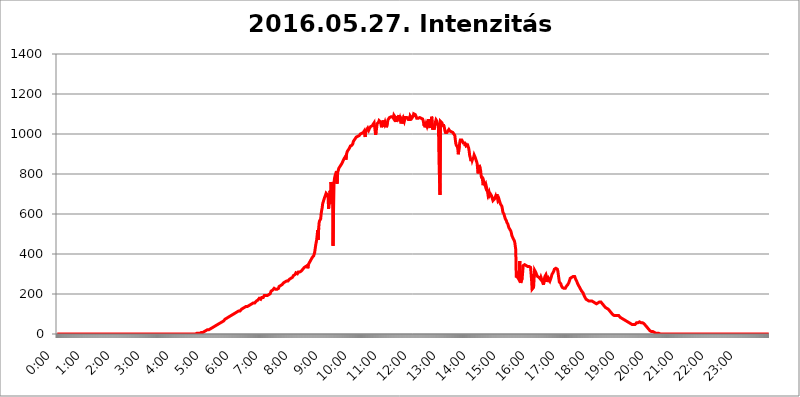
| Category | 2016.05.27. Intenzitás [W/m^2] |
|---|---|
| 0.0 | 0 |
| 0.0006944444444444445 | 0 |
| 0.001388888888888889 | 0 |
| 0.0020833333333333333 | 0 |
| 0.002777777777777778 | 0 |
| 0.003472222222222222 | 0 |
| 0.004166666666666667 | 0 |
| 0.004861111111111111 | 0 |
| 0.005555555555555556 | 0 |
| 0.0062499999999999995 | 0 |
| 0.006944444444444444 | 0 |
| 0.007638888888888889 | 0 |
| 0.008333333333333333 | 0 |
| 0.009027777777777779 | 0 |
| 0.009722222222222222 | 0 |
| 0.010416666666666666 | 0 |
| 0.011111111111111112 | 0 |
| 0.011805555555555555 | 0 |
| 0.012499999999999999 | 0 |
| 0.013194444444444444 | 0 |
| 0.013888888888888888 | 0 |
| 0.014583333333333332 | 0 |
| 0.015277777777777777 | 0 |
| 0.015972222222222224 | 0 |
| 0.016666666666666666 | 0 |
| 0.017361111111111112 | 0 |
| 0.018055555555555557 | 0 |
| 0.01875 | 0 |
| 0.019444444444444445 | 0 |
| 0.02013888888888889 | 0 |
| 0.020833333333333332 | 0 |
| 0.02152777777777778 | 0 |
| 0.022222222222222223 | 0 |
| 0.02291666666666667 | 0 |
| 0.02361111111111111 | 0 |
| 0.024305555555555556 | 0 |
| 0.024999999999999998 | 0 |
| 0.025694444444444447 | 0 |
| 0.02638888888888889 | 0 |
| 0.027083333333333334 | 0 |
| 0.027777777777777776 | 0 |
| 0.02847222222222222 | 0 |
| 0.029166666666666664 | 0 |
| 0.029861111111111113 | 0 |
| 0.030555555555555555 | 0 |
| 0.03125 | 0 |
| 0.03194444444444445 | 0 |
| 0.03263888888888889 | 0 |
| 0.03333333333333333 | 0 |
| 0.034027777777777775 | 0 |
| 0.034722222222222224 | 0 |
| 0.035416666666666666 | 0 |
| 0.036111111111111115 | 0 |
| 0.03680555555555556 | 0 |
| 0.0375 | 0 |
| 0.03819444444444444 | 0 |
| 0.03888888888888889 | 0 |
| 0.03958333333333333 | 0 |
| 0.04027777777777778 | 0 |
| 0.04097222222222222 | 0 |
| 0.041666666666666664 | 0 |
| 0.042361111111111106 | 0 |
| 0.04305555555555556 | 0 |
| 0.043750000000000004 | 0 |
| 0.044444444444444446 | 0 |
| 0.04513888888888889 | 0 |
| 0.04583333333333334 | 0 |
| 0.04652777777777778 | 0 |
| 0.04722222222222222 | 0 |
| 0.04791666666666666 | 0 |
| 0.04861111111111111 | 0 |
| 0.049305555555555554 | 0 |
| 0.049999999999999996 | 0 |
| 0.05069444444444445 | 0 |
| 0.051388888888888894 | 0 |
| 0.052083333333333336 | 0 |
| 0.05277777777777778 | 0 |
| 0.05347222222222222 | 0 |
| 0.05416666666666667 | 0 |
| 0.05486111111111111 | 0 |
| 0.05555555555555555 | 0 |
| 0.05625 | 0 |
| 0.05694444444444444 | 0 |
| 0.057638888888888885 | 0 |
| 0.05833333333333333 | 0 |
| 0.05902777777777778 | 0 |
| 0.059722222222222225 | 0 |
| 0.06041666666666667 | 0 |
| 0.061111111111111116 | 0 |
| 0.06180555555555556 | 0 |
| 0.0625 | 0 |
| 0.06319444444444444 | 0 |
| 0.06388888888888888 | 0 |
| 0.06458333333333334 | 0 |
| 0.06527777777777778 | 0 |
| 0.06597222222222222 | 0 |
| 0.06666666666666667 | 0 |
| 0.06736111111111111 | 0 |
| 0.06805555555555555 | 0 |
| 0.06874999999999999 | 0 |
| 0.06944444444444443 | 0 |
| 0.07013888888888889 | 0 |
| 0.07083333333333333 | 0 |
| 0.07152777777777779 | 0 |
| 0.07222222222222223 | 0 |
| 0.07291666666666667 | 0 |
| 0.07361111111111111 | 0 |
| 0.07430555555555556 | 0 |
| 0.075 | 0 |
| 0.07569444444444444 | 0 |
| 0.0763888888888889 | 0 |
| 0.07708333333333334 | 0 |
| 0.07777777777777778 | 0 |
| 0.07847222222222222 | 0 |
| 0.07916666666666666 | 0 |
| 0.0798611111111111 | 0 |
| 0.08055555555555556 | 0 |
| 0.08125 | 0 |
| 0.08194444444444444 | 0 |
| 0.08263888888888889 | 0 |
| 0.08333333333333333 | 0 |
| 0.08402777777777777 | 0 |
| 0.08472222222222221 | 0 |
| 0.08541666666666665 | 0 |
| 0.08611111111111112 | 0 |
| 0.08680555555555557 | 0 |
| 0.08750000000000001 | 0 |
| 0.08819444444444445 | 0 |
| 0.08888888888888889 | 0 |
| 0.08958333333333333 | 0 |
| 0.09027777777777778 | 0 |
| 0.09097222222222222 | 0 |
| 0.09166666666666667 | 0 |
| 0.09236111111111112 | 0 |
| 0.09305555555555556 | 0 |
| 0.09375 | 0 |
| 0.09444444444444444 | 0 |
| 0.09513888888888888 | 0 |
| 0.09583333333333333 | 0 |
| 0.09652777777777777 | 0 |
| 0.09722222222222222 | 0 |
| 0.09791666666666667 | 0 |
| 0.09861111111111111 | 0 |
| 0.09930555555555555 | 0 |
| 0.09999999999999999 | 0 |
| 0.10069444444444443 | 0 |
| 0.1013888888888889 | 0 |
| 0.10208333333333335 | 0 |
| 0.10277777777777779 | 0 |
| 0.10347222222222223 | 0 |
| 0.10416666666666667 | 0 |
| 0.10486111111111111 | 0 |
| 0.10555555555555556 | 0 |
| 0.10625 | 0 |
| 0.10694444444444444 | 0 |
| 0.1076388888888889 | 0 |
| 0.10833333333333334 | 0 |
| 0.10902777777777778 | 0 |
| 0.10972222222222222 | 0 |
| 0.1111111111111111 | 0 |
| 0.11180555555555556 | 0 |
| 0.11180555555555556 | 0 |
| 0.1125 | 0 |
| 0.11319444444444444 | 0 |
| 0.11388888888888889 | 0 |
| 0.11458333333333333 | 0 |
| 0.11527777777777777 | 0 |
| 0.11597222222222221 | 0 |
| 0.11666666666666665 | 0 |
| 0.1173611111111111 | 0 |
| 0.11805555555555557 | 0 |
| 0.11944444444444445 | 0 |
| 0.12013888888888889 | 0 |
| 0.12083333333333333 | 0 |
| 0.12152777777777778 | 0 |
| 0.12222222222222223 | 0 |
| 0.12291666666666667 | 0 |
| 0.12291666666666667 | 0 |
| 0.12361111111111112 | 0 |
| 0.12430555555555556 | 0 |
| 0.125 | 0 |
| 0.12569444444444444 | 0 |
| 0.12638888888888888 | 0 |
| 0.12708333333333333 | 0 |
| 0.16875 | 0 |
| 0.12847222222222224 | 0 |
| 0.12916666666666668 | 0 |
| 0.12986111111111112 | 0 |
| 0.13055555555555556 | 0 |
| 0.13125 | 0 |
| 0.13194444444444445 | 0 |
| 0.1326388888888889 | 0 |
| 0.13333333333333333 | 0 |
| 0.13402777777777777 | 0 |
| 0.13402777777777777 | 0 |
| 0.13472222222222222 | 0 |
| 0.13541666666666666 | 0 |
| 0.1361111111111111 | 0 |
| 0.13749999999999998 | 0 |
| 0.13819444444444443 | 0 |
| 0.1388888888888889 | 0 |
| 0.13958333333333334 | 0 |
| 0.14027777777777778 | 0 |
| 0.14097222222222222 | 0 |
| 0.14166666666666666 | 0 |
| 0.1423611111111111 | 0 |
| 0.14305555555555557 | 0 |
| 0.14375000000000002 | 0 |
| 0.14444444444444446 | 0 |
| 0.1451388888888889 | 0 |
| 0.1451388888888889 | 0 |
| 0.14652777777777778 | 0 |
| 0.14722222222222223 | 0 |
| 0.14791666666666667 | 0 |
| 0.1486111111111111 | 0 |
| 0.14930555555555555 | 0 |
| 0.15 | 0 |
| 0.15069444444444444 | 0 |
| 0.15138888888888888 | 0 |
| 0.15208333333333332 | 0 |
| 0.15277777777777776 | 0 |
| 0.15347222222222223 | 0 |
| 0.15416666666666667 | 0 |
| 0.15486111111111112 | 0 |
| 0.15555555555555556 | 0 |
| 0.15625 | 0 |
| 0.15694444444444444 | 0 |
| 0.15763888888888888 | 0 |
| 0.15833333333333333 | 0 |
| 0.15902777777777777 | 0 |
| 0.15972222222222224 | 0 |
| 0.16041666666666668 | 0 |
| 0.16111111111111112 | 0 |
| 0.16180555555555556 | 0 |
| 0.1625 | 0 |
| 0.16319444444444445 | 0 |
| 0.1638888888888889 | 0 |
| 0.16458333333333333 | 0 |
| 0.16527777777777777 | 0 |
| 0.16597222222222222 | 0 |
| 0.16666666666666666 | 0 |
| 0.1673611111111111 | 0 |
| 0.16805555555555554 | 0 |
| 0.16874999999999998 | 0 |
| 0.16944444444444443 | 0 |
| 0.17013888888888887 | 0 |
| 0.1708333333333333 | 0 |
| 0.17152777777777775 | 0 |
| 0.17222222222222225 | 0 |
| 0.1729166666666667 | 0 |
| 0.17361111111111113 | 0 |
| 0.17430555555555557 | 0 |
| 0.17500000000000002 | 0 |
| 0.17569444444444446 | 0 |
| 0.1763888888888889 | 0 |
| 0.17708333333333334 | 0 |
| 0.17777777777777778 | 0 |
| 0.17847222222222223 | 0 |
| 0.17916666666666667 | 0 |
| 0.1798611111111111 | 0 |
| 0.18055555555555555 | 0 |
| 0.18125 | 0 |
| 0.18194444444444444 | 0 |
| 0.1826388888888889 | 0 |
| 0.18333333333333335 | 0 |
| 0.1840277777777778 | 0 |
| 0.18472222222222223 | 0 |
| 0.18541666666666667 | 0 |
| 0.18611111111111112 | 0 |
| 0.18680555555555556 | 0 |
| 0.1875 | 0 |
| 0.18819444444444444 | 0 |
| 0.18888888888888888 | 0 |
| 0.18958333333333333 | 0 |
| 0.19027777777777777 | 0 |
| 0.1909722222222222 | 0 |
| 0.19166666666666665 | 0 |
| 0.19236111111111112 | 0 |
| 0.19305555555555554 | 0 |
| 0.19375 | 0 |
| 0.19444444444444445 | 3.525 |
| 0.1951388888888889 | 3.525 |
| 0.19583333333333333 | 3.525 |
| 0.19652777777777777 | 3.525 |
| 0.19722222222222222 | 3.525 |
| 0.19791666666666666 | 3.525 |
| 0.1986111111111111 | 3.525 |
| 0.19930555555555554 | 3.525 |
| 0.19999999999999998 | 3.525 |
| 0.20069444444444443 | 3.525 |
| 0.20138888888888887 | 7.887 |
| 0.2020833333333333 | 7.887 |
| 0.2027777777777778 | 7.887 |
| 0.2034722222222222 | 7.887 |
| 0.2041666666666667 | 7.887 |
| 0.20486111111111113 | 12.257 |
| 0.20555555555555557 | 12.257 |
| 0.20625000000000002 | 12.257 |
| 0.20694444444444446 | 12.257 |
| 0.2076388888888889 | 12.257 |
| 0.20833333333333334 | 16.636 |
| 0.20902777777777778 | 16.636 |
| 0.20972222222222223 | 16.636 |
| 0.21041666666666667 | 21.024 |
| 0.2111111111111111 | 21.024 |
| 0.21180555555555555 | 21.024 |
| 0.2125 | 21.024 |
| 0.21319444444444444 | 25.419 |
| 0.2138888888888889 | 25.419 |
| 0.21458333333333335 | 25.419 |
| 0.2152777777777778 | 29.823 |
| 0.21597222222222223 | 29.823 |
| 0.21666666666666667 | 29.823 |
| 0.21736111111111112 | 29.823 |
| 0.21805555555555556 | 34.234 |
| 0.21875 | 34.234 |
| 0.21944444444444444 | 34.234 |
| 0.22013888888888888 | 38.653 |
| 0.22083333333333333 | 38.653 |
| 0.22152777777777777 | 38.653 |
| 0.2222222222222222 | 43.079 |
| 0.22291666666666665 | 43.079 |
| 0.2236111111111111 | 47.511 |
| 0.22430555555555556 | 47.511 |
| 0.225 | 47.511 |
| 0.22569444444444445 | 47.511 |
| 0.2263888888888889 | 51.951 |
| 0.22708333333333333 | 51.951 |
| 0.22777777777777777 | 56.398 |
| 0.22847222222222222 | 56.398 |
| 0.22916666666666666 | 56.398 |
| 0.2298611111111111 | 60.85 |
| 0.23055555555555554 | 60.85 |
| 0.23124999999999998 | 60.85 |
| 0.23194444444444443 | 65.31 |
| 0.23263888888888887 | 65.31 |
| 0.2333333333333333 | 65.31 |
| 0.2340277777777778 | 69.775 |
| 0.2347222222222222 | 69.775 |
| 0.2354166666666667 | 74.246 |
| 0.23611111111111113 | 74.246 |
| 0.23680555555555557 | 74.246 |
| 0.23750000000000002 | 78.722 |
| 0.23819444444444446 | 78.722 |
| 0.2388888888888889 | 83.205 |
| 0.23958333333333334 | 83.205 |
| 0.24027777777777778 | 83.205 |
| 0.24097222222222223 | 83.205 |
| 0.24166666666666667 | 87.692 |
| 0.2423611111111111 | 92.184 |
| 0.24305555555555555 | 92.184 |
| 0.24375 | 92.184 |
| 0.24444444444444446 | 92.184 |
| 0.24513888888888888 | 96.682 |
| 0.24583333333333335 | 96.682 |
| 0.2465277777777778 | 96.682 |
| 0.24722222222222223 | 101.184 |
| 0.24791666666666667 | 101.184 |
| 0.24861111111111112 | 101.184 |
| 0.24930555555555556 | 105.69 |
| 0.25 | 105.69 |
| 0.25069444444444444 | 105.69 |
| 0.2513888888888889 | 110.201 |
| 0.2520833333333333 | 110.201 |
| 0.25277777777777777 | 110.201 |
| 0.2534722222222222 | 110.201 |
| 0.25416666666666665 | 114.716 |
| 0.2548611111111111 | 114.716 |
| 0.2555555555555556 | 114.716 |
| 0.25625000000000003 | 114.716 |
| 0.2569444444444445 | 114.716 |
| 0.2576388888888889 | 119.235 |
| 0.25833333333333336 | 123.758 |
| 0.2590277777777778 | 123.758 |
| 0.25972222222222224 | 123.758 |
| 0.2604166666666667 | 128.284 |
| 0.2611111111111111 | 128.284 |
| 0.26180555555555557 | 128.284 |
| 0.2625 | 132.814 |
| 0.26319444444444445 | 132.814 |
| 0.2638888888888889 | 132.814 |
| 0.26458333333333334 | 137.347 |
| 0.2652777777777778 | 137.347 |
| 0.2659722222222222 | 137.347 |
| 0.26666666666666666 | 137.347 |
| 0.2673611111111111 | 137.347 |
| 0.26805555555555555 | 141.884 |
| 0.26875 | 141.884 |
| 0.26944444444444443 | 146.423 |
| 0.2701388888888889 | 146.423 |
| 0.2708333333333333 | 146.423 |
| 0.27152777777777776 | 146.423 |
| 0.2722222222222222 | 150.964 |
| 0.27291666666666664 | 150.964 |
| 0.2736111111111111 | 150.964 |
| 0.2743055555555555 | 155.509 |
| 0.27499999999999997 | 155.509 |
| 0.27569444444444446 | 150.964 |
| 0.27638888888888885 | 150.964 |
| 0.27708333333333335 | 155.509 |
| 0.2777777777777778 | 150.964 |
| 0.27847222222222223 | 160.056 |
| 0.2791666666666667 | 164.605 |
| 0.2798611111111111 | 164.605 |
| 0.28055555555555556 | 160.056 |
| 0.28125 | 169.156 |
| 0.28194444444444444 | 173.709 |
| 0.2826388888888889 | 173.709 |
| 0.2833333333333333 | 178.264 |
| 0.28402777777777777 | 178.264 |
| 0.2847222222222222 | 178.264 |
| 0.28541666666666665 | 173.709 |
| 0.28611111111111115 | 178.264 |
| 0.28680555555555554 | 182.82 |
| 0.28750000000000003 | 182.82 |
| 0.2881944444444445 | 182.82 |
| 0.2888888888888889 | 182.82 |
| 0.28958333333333336 | 187.378 |
| 0.2902777777777778 | 191.937 |
| 0.29097222222222224 | 191.937 |
| 0.2916666666666667 | 191.937 |
| 0.2923611111111111 | 191.937 |
| 0.29305555555555557 | 187.378 |
| 0.29375 | 191.937 |
| 0.29444444444444445 | 191.937 |
| 0.2951388888888889 | 191.937 |
| 0.29583333333333334 | 191.937 |
| 0.2965277777777778 | 196.497 |
| 0.2972222222222222 | 201.058 |
| 0.29791666666666666 | 201.058 |
| 0.2986111111111111 | 201.058 |
| 0.29930555555555555 | 205.62 |
| 0.3 | 214.746 |
| 0.30069444444444443 | 214.746 |
| 0.3013888888888889 | 214.746 |
| 0.3020833333333333 | 219.309 |
| 0.30277777777777776 | 219.309 |
| 0.3034722222222222 | 223.873 |
| 0.30416666666666664 | 228.436 |
| 0.3048611111111111 | 223.873 |
| 0.3055555555555555 | 223.873 |
| 0.30624999999999997 | 223.873 |
| 0.3069444444444444 | 228.436 |
| 0.3076388888888889 | 228.436 |
| 0.30833333333333335 | 223.873 |
| 0.3090277777777778 | 223.873 |
| 0.30972222222222223 | 223.873 |
| 0.3104166666666667 | 228.436 |
| 0.3111111111111111 | 237.564 |
| 0.31180555555555556 | 237.564 |
| 0.3125 | 242.127 |
| 0.31319444444444444 | 242.127 |
| 0.3138888888888889 | 242.127 |
| 0.3145833333333333 | 242.127 |
| 0.31527777777777777 | 246.689 |
| 0.3159722222222222 | 246.689 |
| 0.31666666666666665 | 251.251 |
| 0.31736111111111115 | 255.813 |
| 0.31805555555555554 | 255.813 |
| 0.31875000000000003 | 255.813 |
| 0.3194444444444445 | 260.373 |
| 0.3201388888888889 | 260.373 |
| 0.32083333333333336 | 260.373 |
| 0.3215277777777778 | 264.932 |
| 0.32222222222222224 | 269.49 |
| 0.3229166666666667 | 260.373 |
| 0.3236111111111111 | 264.932 |
| 0.32430555555555557 | 269.49 |
| 0.325 | 269.49 |
| 0.32569444444444445 | 274.047 |
| 0.3263888888888889 | 278.603 |
| 0.32708333333333334 | 278.603 |
| 0.3277777777777778 | 278.603 |
| 0.3284722222222222 | 274.047 |
| 0.32916666666666666 | 278.603 |
| 0.3298611111111111 | 283.156 |
| 0.33055555555555555 | 287.709 |
| 0.33125 | 292.259 |
| 0.33194444444444443 | 292.259 |
| 0.3326388888888889 | 296.808 |
| 0.3333333333333333 | 296.808 |
| 0.3340277777777778 | 301.354 |
| 0.3347222222222222 | 305.898 |
| 0.3354166666666667 | 305.898 |
| 0.3361111111111111 | 305.898 |
| 0.3368055555555556 | 301.354 |
| 0.33749999999999997 | 305.898 |
| 0.33819444444444446 | 310.44 |
| 0.33888888888888885 | 310.44 |
| 0.33958333333333335 | 310.44 |
| 0.34027777777777773 | 310.44 |
| 0.34097222222222223 | 310.44 |
| 0.3416666666666666 | 310.44 |
| 0.3423611111111111 | 314.98 |
| 0.3430555555555555 | 319.517 |
| 0.34375 | 319.517 |
| 0.3444444444444445 | 324.052 |
| 0.3451388888888889 | 324.052 |
| 0.3458333333333334 | 328.584 |
| 0.34652777777777777 | 333.113 |
| 0.34722222222222227 | 333.113 |
| 0.34791666666666665 | 337.639 |
| 0.34861111111111115 | 337.639 |
| 0.34930555555555554 | 342.162 |
| 0.35000000000000003 | 342.162 |
| 0.3506944444444444 | 342.162 |
| 0.3513888888888889 | 328.584 |
| 0.3520833333333333 | 346.682 |
| 0.3527777777777778 | 351.198 |
| 0.3534722222222222 | 355.712 |
| 0.3541666666666667 | 360.221 |
| 0.3548611111111111 | 364.728 |
| 0.35555555555555557 | 369.23 |
| 0.35625 | 373.729 |
| 0.35694444444444445 | 378.224 |
| 0.3576388888888889 | 382.715 |
| 0.35833333333333334 | 387.202 |
| 0.3590277777777778 | 387.202 |
| 0.3597222222222222 | 391.685 |
| 0.36041666666666666 | 400.638 |
| 0.3611111111111111 | 409.574 |
| 0.36180555555555555 | 427.39 |
| 0.3625 | 445.129 |
| 0.36319444444444443 | 458.38 |
| 0.3638888888888889 | 471.582 |
| 0.3645833333333333 | 475.972 |
| 0.3652777777777778 | 519.555 |
| 0.3659722222222222 | 471.582 |
| 0.3666666666666667 | 528.2 |
| 0.3673611111111111 | 558.261 |
| 0.3680555555555556 | 566.793 |
| 0.36874999999999997 | 562.53 |
| 0.36944444444444446 | 575.299 |
| 0.37013888888888885 | 600.661 |
| 0.37083333333333335 | 617.436 |
| 0.37152777777777773 | 629.948 |
| 0.37222222222222223 | 650.667 |
| 0.3729166666666666 | 658.909 |
| 0.3736111111111111 | 667.123 |
| 0.3743055555555555 | 667.123 |
| 0.375 | 683.473 |
| 0.3756944444444445 | 683.473 |
| 0.3763888888888889 | 695.666 |
| 0.3770833333333334 | 703.762 |
| 0.37777777777777777 | 699.717 |
| 0.37847222222222227 | 699.717 |
| 0.37916666666666665 | 695.666 |
| 0.37986111111111115 | 683.473 |
| 0.38055555555555554 | 625.784 |
| 0.38125000000000003 | 621.613 |
| 0.3819444444444444 | 687.544 |
| 0.3826388888888889 | 715.858 |
| 0.3833333333333333 | 650.667 |
| 0.3840277777777778 | 759.723 |
| 0.3847222222222222 | 747.834 |
| 0.3854166666666667 | 715.858 |
| 0.3861111111111111 | 699.717 |
| 0.38680555555555557 | 440.702 |
| 0.3875 | 617.436 |
| 0.38819444444444445 | 755.766 |
| 0.3888888888888889 | 779.42 |
| 0.38958333333333334 | 791.169 |
| 0.3902777777777778 | 795.074 |
| 0.3909722222222222 | 806.757 |
| 0.39166666666666666 | 814.519 |
| 0.3923611111111111 | 751.803 |
| 0.39305555555555555 | 798.974 |
| 0.39375 | 814.519 |
| 0.39444444444444443 | 822.26 |
| 0.3951388888888889 | 829.981 |
| 0.3958333333333333 | 833.834 |
| 0.3965277777777778 | 837.682 |
| 0.3972222222222222 | 841.526 |
| 0.3979166666666667 | 845.365 |
| 0.3986111111111111 | 849.199 |
| 0.3993055555555556 | 853.029 |
| 0.39999999999999997 | 856.855 |
| 0.40069444444444446 | 864.493 |
| 0.40138888888888885 | 868.305 |
| 0.40208333333333335 | 868.305 |
| 0.40277777777777773 | 879.719 |
| 0.40347222222222223 | 883.516 |
| 0.4041666666666666 | 887.309 |
| 0.4048611111111111 | 872.114 |
| 0.4055555555555555 | 894.885 |
| 0.40625 | 906.223 |
| 0.4069444444444445 | 913.766 |
| 0.4076388888888889 | 917.534 |
| 0.4083333333333334 | 921.298 |
| 0.40902777777777777 | 921.298 |
| 0.40972222222222227 | 928.819 |
| 0.41041666666666665 | 928.819 |
| 0.41111111111111115 | 940.082 |
| 0.41180555555555554 | 940.082 |
| 0.41250000000000003 | 940.082 |
| 0.4131944444444444 | 943.832 |
| 0.4138888888888889 | 947.58 |
| 0.4145833333333333 | 951.327 |
| 0.4152777777777778 | 962.555 |
| 0.4159722222222222 | 966.295 |
| 0.4166666666666667 | 970.034 |
| 0.4173611111111111 | 973.772 |
| 0.41805555555555557 | 977.508 |
| 0.41875 | 981.244 |
| 0.41944444444444445 | 984.98 |
| 0.4201388888888889 | 984.98 |
| 0.42083333333333334 | 984.98 |
| 0.4215277777777778 | 988.714 |
| 0.4222222222222222 | 992.448 |
| 0.42291666666666666 | 988.714 |
| 0.4236111111111111 | 992.448 |
| 0.42430555555555555 | 996.182 |
| 0.425 | 999.916 |
| 0.42569444444444443 | 999.916 |
| 0.4263888888888889 | 1003.65 |
| 0.4270833333333333 | 1003.65 |
| 0.4277777777777778 | 1003.65 |
| 0.4284722222222222 | 1003.65 |
| 0.4291666666666667 | 1007.383 |
| 0.4298611111111111 | 1011.118 |
| 0.4305555555555556 | 1014.852 |
| 0.43124999999999997 | 1018.587 |
| 0.43194444444444446 | 984.98 |
| 0.43263888888888885 | 1022.323 |
| 0.43333333333333335 | 1014.852 |
| 0.43402777777777773 | 1022.323 |
| 0.43472222222222223 | 1026.06 |
| 0.4354166666666666 | 1029.798 |
| 0.4361111111111111 | 1026.06 |
| 0.4368055555555555 | 1018.587 |
| 0.4375 | 1022.323 |
| 0.4381944444444445 | 1029.798 |
| 0.4388888888888889 | 1033.537 |
| 0.4395833333333334 | 1037.277 |
| 0.44027777777777777 | 1037.277 |
| 0.44097222222222227 | 1037.277 |
| 0.44166666666666665 | 1041.019 |
| 0.44236111111111115 | 1044.762 |
| 0.44305555555555554 | 1048.508 |
| 0.44375000000000003 | 1052.255 |
| 0.4444444444444444 | 1056.004 |
| 0.4451388888888889 | 1056.004 |
| 0.4458333333333333 | 1052.255 |
| 0.4465277777777778 | 996.182 |
| 0.4472222222222222 | 1011.118 |
| 0.4479166666666667 | 1029.798 |
| 0.4486111111111111 | 1052.255 |
| 0.44930555555555557 | 1052.255 |
| 0.45 | 1052.255 |
| 0.45069444444444445 | 1059.756 |
| 0.4513888888888889 | 1067.267 |
| 0.45208333333333334 | 1067.267 |
| 0.4527777777777778 | 1063.51 |
| 0.4534722222222222 | 1059.756 |
| 0.45416666666666666 | 1063.51 |
| 0.4548611111111111 | 1033.537 |
| 0.45555555555555555 | 1048.508 |
| 0.45625 | 1037.277 |
| 0.45694444444444443 | 1067.267 |
| 0.4576388888888889 | 1037.277 |
| 0.4583333333333333 | 1063.51 |
| 0.4590277777777778 | 1052.255 |
| 0.4597222222222222 | 1059.756 |
| 0.4604166666666667 | 1056.004 |
| 0.4611111111111111 | 1056.004 |
| 0.4618055555555556 | 1033.537 |
| 0.46249999999999997 | 1033.537 |
| 0.46319444444444446 | 1059.756 |
| 0.46388888888888885 | 1071.027 |
| 0.46458333333333335 | 1074.789 |
| 0.46527777777777773 | 1074.789 |
| 0.46597222222222223 | 1082.324 |
| 0.4666666666666666 | 1078.555 |
| 0.4673611111111111 | 1078.555 |
| 0.4680555555555555 | 1086.097 |
| 0.46875 | 1086.097 |
| 0.4694444444444445 | 1089.873 |
| 0.4701388888888889 | 1086.097 |
| 0.4708333333333334 | 1086.097 |
| 0.47152777777777777 | 1078.555 |
| 0.47222222222222227 | 1093.653 |
| 0.47291666666666665 | 1093.653 |
| 0.47361111111111115 | 1086.097 |
| 0.47430555555555554 | 1089.873 |
| 0.47500000000000003 | 1059.756 |
| 0.4756944444444444 | 1089.873 |
| 0.4763888888888889 | 1063.51 |
| 0.4770833333333333 | 1067.267 |
| 0.4777777777777778 | 1082.324 |
| 0.4784722222222222 | 1082.324 |
| 0.4791666666666667 | 1093.653 |
| 0.4798611111111111 | 1071.027 |
| 0.48055555555555557 | 1078.555 |
| 0.48125 | 1067.267 |
| 0.48194444444444445 | 1071.027 |
| 0.4826388888888889 | 1074.789 |
| 0.48333333333333334 | 1052.255 |
| 0.4840277777777778 | 1063.51 |
| 0.4847222222222222 | 1071.027 |
| 0.48541666666666666 | 1078.555 |
| 0.4861111111111111 | 1082.324 |
| 0.48680555555555555 | 1063.51 |
| 0.4875 | 1067.267 |
| 0.48819444444444443 | 1082.324 |
| 0.4888888888888889 | 1082.324 |
| 0.4895833333333333 | 1078.555 |
| 0.4902777777777778 | 1082.324 |
| 0.4909722222222222 | 1082.324 |
| 0.4916666666666667 | 1078.555 |
| 0.4923611111111111 | 1074.789 |
| 0.4930555555555556 | 1067.267 |
| 0.49374999999999997 | 1086.097 |
| 0.49444444444444446 | 1067.267 |
| 0.49513888888888885 | 1089.873 |
| 0.49583333333333335 | 1093.653 |
| 0.49652777777777773 | 1086.097 |
| 0.49722222222222223 | 1078.555 |
| 0.4979166666666666 | 1074.789 |
| 0.4986111111111111 | 1082.324 |
| 0.4993055555555555 | 1089.873 |
| 0.5 | 1101.226 |
| 0.5006944444444444 | 1101.226 |
| 0.5013888888888889 | 1097.437 |
| 0.5020833333333333 | 1097.437 |
| 0.5027777777777778 | 1093.653 |
| 0.5034722222222222 | 1086.097 |
| 0.5041666666666667 | 1078.555 |
| 0.5048611111111111 | 1082.324 |
| 0.5055555555555555 | 1082.324 |
| 0.50625 | 1078.555 |
| 0.5069444444444444 | 1078.555 |
| 0.5076388888888889 | 1078.555 |
| 0.5083333333333333 | 1082.324 |
| 0.5090277777777777 | 1078.555 |
| 0.5097222222222222 | 1078.555 |
| 0.5104166666666666 | 1078.555 |
| 0.5111111111111112 | 1074.789 |
| 0.5118055555555555 | 1074.789 |
| 0.5125000000000001 | 1074.789 |
| 0.5131944444444444 | 1067.267 |
| 0.513888888888889 | 1067.267 |
| 0.5145833333333333 | 1041.019 |
| 0.5152777777777778 | 1059.756 |
| 0.5159722222222222 | 1033.537 |
| 0.5166666666666667 | 1033.537 |
| 0.517361111111111 | 1052.255 |
| 0.5180555555555556 | 1052.255 |
| 0.5187499999999999 | 1037.277 |
| 0.5194444444444445 | 1037.277 |
| 0.5201388888888888 | 1052.255 |
| 0.5208333333333334 | 1074.789 |
| 0.5215277777777778 | 1044.762 |
| 0.5222222222222223 | 1041.019 |
| 0.5229166666666667 | 1029.798 |
| 0.5236111111111111 | 1056.004 |
| 0.5243055555555556 | 1048.508 |
| 0.525 | 1086.097 |
| 0.5256944444444445 | 1078.555 |
| 0.5263888888888889 | 1022.323 |
| 0.5270833333333333 | 1044.762 |
| 0.5277777777777778 | 1048.508 |
| 0.5284722222222222 | 1022.323 |
| 0.5291666666666667 | 1018.587 |
| 0.5298611111111111 | 1052.255 |
| 0.5305555555555556 | 1052.255 |
| 0.53125 | 1071.027 |
| 0.5319444444444444 | 1071.027 |
| 0.5326388888888889 | 1063.51 |
| 0.5333333333333333 | 1052.255 |
| 0.5340277777777778 | 1044.762 |
| 0.5347222222222222 | 1026.06 |
| 0.5354166666666667 | 872.114 |
| 0.5361111111111111 | 775.492 |
| 0.5368055555555555 | 695.666 |
| 0.5375 | 1063.51 |
| 0.5381944444444444 | 1063.51 |
| 0.5388888888888889 | 1063.51 |
| 0.5395833333333333 | 1056.004 |
| 0.5402777777777777 | 1048.508 |
| 0.5409722222222222 | 1037.277 |
| 0.5416666666666666 | 1048.508 |
| 0.5423611111111112 | 1037.277 |
| 0.5430555555555555 | 1029.798 |
| 0.5437500000000001 | 1014.852 |
| 0.5444444444444444 | 1007.383 |
| 0.545138888888889 | 1003.65 |
| 0.5458333333333333 | 1007.383 |
| 0.5465277777777778 | 1007.383 |
| 0.5472222222222222 | 1007.383 |
| 0.5479166666666667 | 1014.852 |
| 0.548611111111111 | 1018.587 |
| 0.5493055555555556 | 1022.323 |
| 0.5499999999999999 | 1018.587 |
| 0.5506944444444445 | 1014.852 |
| 0.5513888888888888 | 1011.118 |
| 0.5520833333333334 | 1014.852 |
| 0.5527777777777778 | 1011.118 |
| 0.5534722222222223 | 1011.118 |
| 0.5541666666666667 | 1011.118 |
| 0.5548611111111111 | 1007.383 |
| 0.5555555555555556 | 1007.383 |
| 0.55625 | 999.916 |
| 0.5569444444444445 | 999.916 |
| 0.5576388888888889 | 992.448 |
| 0.5583333333333333 | 970.034 |
| 0.5590277777777778 | 951.327 |
| 0.5597222222222222 | 943.832 |
| 0.5604166666666667 | 940.082 |
| 0.5611111111111111 | 936.33 |
| 0.5618055555555556 | 925.06 |
| 0.5625 | 898.668 |
| 0.5631944444444444 | 898.668 |
| 0.5638888888888889 | 940.082 |
| 0.5645833333333333 | 958.814 |
| 0.5652777777777778 | 970.034 |
| 0.5659722222222222 | 970.034 |
| 0.5666666666666667 | 973.772 |
| 0.5673611111111111 | 970.034 |
| 0.5680555555555555 | 966.295 |
| 0.56875 | 966.295 |
| 0.5694444444444444 | 955.071 |
| 0.5701388888888889 | 958.814 |
| 0.5708333333333333 | 958.814 |
| 0.5715277777777777 | 955.071 |
| 0.5722222222222222 | 940.082 |
| 0.5729166666666666 | 955.071 |
| 0.5736111111111112 | 940.082 |
| 0.5743055555555555 | 940.082 |
| 0.5750000000000001 | 940.082 |
| 0.5756944444444444 | 943.832 |
| 0.576388888888889 | 940.082 |
| 0.5770833333333333 | 928.819 |
| 0.5777777777777778 | 913.766 |
| 0.5784722222222222 | 891.099 |
| 0.5791666666666667 | 883.516 |
| 0.579861111111111 | 872.114 |
| 0.5805555555555556 | 864.493 |
| 0.5812499999999999 | 879.719 |
| 0.5819444444444445 | 868.305 |
| 0.5826388888888888 | 875.918 |
| 0.5833333333333334 | 875.918 |
| 0.5840277777777778 | 883.516 |
| 0.5847222222222223 | 894.885 |
| 0.5854166666666667 | 894.885 |
| 0.5861111111111111 | 883.516 |
| 0.5868055555555556 | 887.309 |
| 0.5875 | 868.305 |
| 0.5881944444444445 | 868.305 |
| 0.5888888888888889 | 853.029 |
| 0.5895833333333333 | 826.123 |
| 0.5902777777777778 | 802.868 |
| 0.5909722222222222 | 829.981 |
| 0.5916666666666667 | 845.365 |
| 0.5923611111111111 | 841.526 |
| 0.5930555555555556 | 829.981 |
| 0.59375 | 818.392 |
| 0.5944444444444444 | 795.074 |
| 0.5951388888888889 | 779.42 |
| 0.5958333333333333 | 787.258 |
| 0.5965277777777778 | 767.62 |
| 0.5972222222222222 | 743.859 |
| 0.5979166666666667 | 739.877 |
| 0.5986111111111111 | 759.723 |
| 0.5993055555555555 | 751.803 |
| 0.6 | 743.859 |
| 0.6006944444444444 | 735.89 |
| 0.6013888888888889 | 743.859 |
| 0.6020833333333333 | 743.859 |
| 0.6027777777777777 | 739.877 |
| 0.6034722222222222 | 711.832 |
| 0.6041666666666666 | 695.666 |
| 0.6048611111111112 | 699.717 |
| 0.6055555555555555 | 707.8 |
| 0.6062500000000001 | 691.608 |
| 0.6069444444444444 | 695.666 |
| 0.607638888888889 | 699.717 |
| 0.6083333333333333 | 699.717 |
| 0.6090277777777778 | 691.608 |
| 0.6097222222222222 | 687.544 |
| 0.6104166666666667 | 687.544 |
| 0.611111111111111 | 667.123 |
| 0.6118055555555556 | 671.22 |
| 0.6124999999999999 | 663.019 |
| 0.6131944444444445 | 675.311 |
| 0.6138888888888888 | 671.22 |
| 0.6145833333333334 | 687.544 |
| 0.6152777777777778 | 675.311 |
| 0.6159722222222223 | 691.608 |
| 0.6166666666666667 | 699.717 |
| 0.6173611111111111 | 679.395 |
| 0.6180555555555556 | 667.123 |
| 0.61875 | 667.123 |
| 0.6194444444444445 | 675.311 |
| 0.6201388888888889 | 667.123 |
| 0.6208333333333333 | 663.019 |
| 0.6215277777777778 | 650.667 |
| 0.6222222222222222 | 646.537 |
| 0.6229166666666667 | 646.537 |
| 0.6236111111111111 | 638.256 |
| 0.6243055555555556 | 625.784 |
| 0.625 | 609.062 |
| 0.6256944444444444 | 609.062 |
| 0.6263888888888889 | 600.661 |
| 0.6270833333333333 | 592.233 |
| 0.6277777777777778 | 588.009 |
| 0.6284722222222222 | 575.299 |
| 0.6291666666666667 | 571.049 |
| 0.6298611111111111 | 566.793 |
| 0.6305555555555555 | 558.261 |
| 0.63125 | 553.986 |
| 0.6319444444444444 | 549.704 |
| 0.6326388888888889 | 541.121 |
| 0.6333333333333333 | 532.513 |
| 0.6340277777777777 | 528.2 |
| 0.6347222222222222 | 523.88 |
| 0.6354166666666666 | 519.555 |
| 0.6361111111111112 | 515.223 |
| 0.6368055555555555 | 506.542 |
| 0.6375000000000001 | 493.475 |
| 0.6381944444444444 | 489.108 |
| 0.638888888888889 | 489.108 |
| 0.6395833333333333 | 475.972 |
| 0.6402777777777778 | 475.972 |
| 0.6409722222222222 | 467.187 |
| 0.6416666666666667 | 458.38 |
| 0.642361111111111 | 453.968 |
| 0.6430555555555556 | 422.943 |
| 0.6437499999999999 | 287.709 |
| 0.6444444444444445 | 283.156 |
| 0.6451388888888888 | 283.156 |
| 0.6458333333333334 | 283.156 |
| 0.6465277777777778 | 278.603 |
| 0.6472222222222223 | 274.047 |
| 0.6479166666666667 | 287.709 |
| 0.6486111111111111 | 364.728 |
| 0.6493055555555556 | 305.898 |
| 0.65 | 255.813 |
| 0.6506944444444445 | 251.251 |
| 0.6513888888888889 | 260.373 |
| 0.6520833333333333 | 278.603 |
| 0.6527777777777778 | 310.44 |
| 0.6534722222222222 | 342.162 |
| 0.6541666666666667 | 346.682 |
| 0.6548611111111111 | 346.682 |
| 0.6555555555555556 | 346.682 |
| 0.65625 | 342.162 |
| 0.6569444444444444 | 342.162 |
| 0.6576388888888889 | 342.162 |
| 0.6583333333333333 | 342.162 |
| 0.6590277777777778 | 337.639 |
| 0.6597222222222222 | 337.639 |
| 0.6604166666666667 | 337.639 |
| 0.6611111111111111 | 337.639 |
| 0.6618055555555555 | 337.639 |
| 0.6625 | 337.639 |
| 0.6631944444444444 | 337.639 |
| 0.6638888888888889 | 333.113 |
| 0.6645833333333333 | 328.584 |
| 0.6652777777777777 | 269.49 |
| 0.6659722222222222 | 223.873 |
| 0.6666666666666666 | 223.873 |
| 0.6673611111111111 | 228.436 |
| 0.6680555555555556 | 233 |
| 0.6687500000000001 | 274.047 |
| 0.6694444444444444 | 319.517 |
| 0.6701388888888888 | 319.517 |
| 0.6708333333333334 | 314.98 |
| 0.6715277777777778 | 305.898 |
| 0.6722222222222222 | 296.808 |
| 0.6729166666666666 | 296.808 |
| 0.6736111111111112 | 287.709 |
| 0.6743055555555556 | 287.709 |
| 0.6749999999999999 | 283.156 |
| 0.6756944444444444 | 283.156 |
| 0.6763888888888889 | 278.603 |
| 0.6770833333333334 | 278.603 |
| 0.6777777777777777 | 274.047 |
| 0.6784722222222223 | 283.156 |
| 0.6791666666666667 | 278.603 |
| 0.6798611111111111 | 269.49 |
| 0.6805555555555555 | 260.373 |
| 0.68125 | 255.813 |
| 0.6819444444444445 | 246.689 |
| 0.6826388888888889 | 251.251 |
| 0.6833333333333332 | 278.603 |
| 0.6840277777777778 | 287.709 |
| 0.6847222222222222 | 292.259 |
| 0.6854166666666667 | 296.808 |
| 0.686111111111111 | 287.709 |
| 0.6868055555555556 | 260.373 |
| 0.6875 | 260.373 |
| 0.6881944444444444 | 260.373 |
| 0.688888888888889 | 278.603 |
| 0.6895833333333333 | 283.156 |
| 0.6902777777777778 | 274.047 |
| 0.6909722222222222 | 264.932 |
| 0.6916666666666668 | 264.932 |
| 0.6923611111111111 | 278.603 |
| 0.6930555555555555 | 287.709 |
| 0.69375 | 296.808 |
| 0.6944444444444445 | 301.354 |
| 0.6951388888888889 | 305.898 |
| 0.6958333333333333 | 310.44 |
| 0.6965277777777777 | 314.98 |
| 0.6972222222222223 | 324.052 |
| 0.6979166666666666 | 328.584 |
| 0.6986111111111111 | 324.052 |
| 0.6993055555555556 | 328.584 |
| 0.7000000000000001 | 333.113 |
| 0.7006944444444444 | 328.584 |
| 0.7013888888888888 | 324.052 |
| 0.7020833333333334 | 314.98 |
| 0.7027777777777778 | 296.808 |
| 0.7034722222222222 | 278.603 |
| 0.7041666666666666 | 260.373 |
| 0.7048611111111112 | 260.373 |
| 0.7055555555555556 | 255.813 |
| 0.7062499999999999 | 251.251 |
| 0.7069444444444444 | 242.127 |
| 0.7076388888888889 | 237.564 |
| 0.7083333333333334 | 233 |
| 0.7090277777777777 | 233 |
| 0.7097222222222223 | 233 |
| 0.7104166666666667 | 228.436 |
| 0.7111111111111111 | 228.436 |
| 0.7118055555555555 | 228.436 |
| 0.7125 | 228.436 |
| 0.7131944444444445 | 233 |
| 0.7138888888888889 | 237.564 |
| 0.7145833333333332 | 242.127 |
| 0.7152777777777778 | 242.127 |
| 0.7159722222222222 | 246.689 |
| 0.7166666666666667 | 251.251 |
| 0.717361111111111 | 255.813 |
| 0.7180555555555556 | 260.373 |
| 0.71875 | 269.49 |
| 0.7194444444444444 | 278.603 |
| 0.720138888888889 | 283.156 |
| 0.7208333333333333 | 283.156 |
| 0.7215277777777778 | 283.156 |
| 0.7222222222222222 | 287.709 |
| 0.7229166666666668 | 287.709 |
| 0.7236111111111111 | 287.709 |
| 0.7243055555555555 | 287.709 |
| 0.725 | 287.709 |
| 0.7256944444444445 | 287.709 |
| 0.7263888888888889 | 283.156 |
| 0.7270833333333333 | 274.047 |
| 0.7277777777777777 | 269.49 |
| 0.7284722222222223 | 264.932 |
| 0.7291666666666666 | 260.373 |
| 0.7298611111111111 | 251.251 |
| 0.7305555555555556 | 246.689 |
| 0.7312500000000001 | 242.127 |
| 0.7319444444444444 | 237.564 |
| 0.7326388888888888 | 233 |
| 0.7333333333333334 | 228.436 |
| 0.7340277777777778 | 223.873 |
| 0.7347222222222222 | 219.309 |
| 0.7354166666666666 | 214.746 |
| 0.7361111111111112 | 210.182 |
| 0.7368055555555556 | 210.182 |
| 0.7374999999999999 | 205.62 |
| 0.7381944444444444 | 201.058 |
| 0.7388888888888889 | 191.937 |
| 0.7395833333333334 | 187.378 |
| 0.7402777777777777 | 182.82 |
| 0.7409722222222223 | 178.264 |
| 0.7416666666666667 | 173.709 |
| 0.7423611111111111 | 173.709 |
| 0.7430555555555555 | 169.156 |
| 0.74375 | 169.156 |
| 0.7444444444444445 | 169.156 |
| 0.7451388888888889 | 164.605 |
| 0.7458333333333332 | 164.605 |
| 0.7465277777777778 | 164.605 |
| 0.7472222222222222 | 164.605 |
| 0.7479166666666667 | 164.605 |
| 0.748611111111111 | 164.605 |
| 0.7493055555555556 | 164.605 |
| 0.75 | 164.605 |
| 0.7506944444444444 | 160.056 |
| 0.751388888888889 | 160.056 |
| 0.7520833333333333 | 160.056 |
| 0.7527777777777778 | 160.056 |
| 0.7534722222222222 | 155.509 |
| 0.7541666666666668 | 155.509 |
| 0.7548611111111111 | 155.509 |
| 0.7555555555555555 | 155.509 |
| 0.75625 | 150.964 |
| 0.7569444444444445 | 150.964 |
| 0.7576388888888889 | 155.509 |
| 0.7583333333333333 | 155.509 |
| 0.7590277777777777 | 155.509 |
| 0.7597222222222223 | 155.509 |
| 0.7604166666666666 | 160.056 |
| 0.7611111111111111 | 160.056 |
| 0.7618055555555556 | 160.056 |
| 0.7625000000000001 | 160.056 |
| 0.7631944444444444 | 155.509 |
| 0.7638888888888888 | 155.509 |
| 0.7645833333333334 | 150.964 |
| 0.7652777777777778 | 146.423 |
| 0.7659722222222222 | 146.423 |
| 0.7666666666666666 | 141.884 |
| 0.7673611111111112 | 137.347 |
| 0.7680555555555556 | 137.347 |
| 0.7687499999999999 | 132.814 |
| 0.7694444444444444 | 132.814 |
| 0.7701388888888889 | 128.284 |
| 0.7708333333333334 | 128.284 |
| 0.7715277777777777 | 128.284 |
| 0.7722222222222223 | 128.284 |
| 0.7729166666666667 | 123.758 |
| 0.7736111111111111 | 119.235 |
| 0.7743055555555555 | 119.235 |
| 0.775 | 114.716 |
| 0.7756944444444445 | 110.201 |
| 0.7763888888888889 | 110.201 |
| 0.7770833333333332 | 105.69 |
| 0.7777777777777778 | 101.184 |
| 0.7784722222222222 | 101.184 |
| 0.7791666666666667 | 96.682 |
| 0.779861111111111 | 96.682 |
| 0.7805555555555556 | 92.184 |
| 0.78125 | 92.184 |
| 0.7819444444444444 | 92.184 |
| 0.782638888888889 | 92.184 |
| 0.7833333333333333 | 92.184 |
| 0.7840277777777778 | 92.184 |
| 0.7847222222222222 | 92.184 |
| 0.7854166666666668 | 92.184 |
| 0.7861111111111111 | 92.184 |
| 0.7868055555555555 | 92.184 |
| 0.7875 | 92.184 |
| 0.7881944444444445 | 87.692 |
| 0.7888888888888889 | 87.692 |
| 0.7895833333333333 | 83.205 |
| 0.7902777777777777 | 83.205 |
| 0.7909722222222223 | 83.205 |
| 0.7916666666666666 | 78.722 |
| 0.7923611111111111 | 78.722 |
| 0.7930555555555556 | 74.246 |
| 0.7937500000000001 | 74.246 |
| 0.7944444444444444 | 74.246 |
| 0.7951388888888888 | 69.775 |
| 0.7958333333333334 | 69.775 |
| 0.7965277777777778 | 65.31 |
| 0.7972222222222222 | 65.31 |
| 0.7979166666666666 | 65.31 |
| 0.7986111111111112 | 65.31 |
| 0.7993055555555556 | 60.85 |
| 0.7999999999999999 | 60.85 |
| 0.8006944444444444 | 56.398 |
| 0.8013888888888889 | 56.398 |
| 0.8020833333333334 | 56.398 |
| 0.8027777777777777 | 51.951 |
| 0.8034722222222223 | 51.951 |
| 0.8041666666666667 | 51.951 |
| 0.8048611111111111 | 47.511 |
| 0.8055555555555555 | 47.511 |
| 0.80625 | 47.511 |
| 0.8069444444444445 | 47.511 |
| 0.8076388888888889 | 47.511 |
| 0.8083333333333332 | 47.511 |
| 0.8090277777777778 | 47.511 |
| 0.8097222222222222 | 47.511 |
| 0.8104166666666667 | 47.511 |
| 0.811111111111111 | 51.951 |
| 0.8118055555555556 | 51.951 |
| 0.8125 | 56.398 |
| 0.8131944444444444 | 56.398 |
| 0.813888888888889 | 56.398 |
| 0.8145833333333333 | 56.398 |
| 0.8152777777777778 | 60.85 |
| 0.8159722222222222 | 60.85 |
| 0.8166666666666668 | 60.85 |
| 0.8173611111111111 | 60.85 |
| 0.8180555555555555 | 56.398 |
| 0.81875 | 56.398 |
| 0.8194444444444445 | 56.398 |
| 0.8201388888888889 | 56.398 |
| 0.8208333333333333 | 56.398 |
| 0.8215277777777777 | 51.951 |
| 0.8222222222222223 | 51.951 |
| 0.8229166666666666 | 51.951 |
| 0.8236111111111111 | 47.511 |
| 0.8243055555555556 | 47.511 |
| 0.8250000000000001 | 43.079 |
| 0.8256944444444444 | 38.653 |
| 0.8263888888888888 | 38.653 |
| 0.8270833333333334 | 34.234 |
| 0.8277777777777778 | 29.823 |
| 0.8284722222222222 | 29.823 |
| 0.8291666666666666 | 25.419 |
| 0.8298611111111112 | 21.024 |
| 0.8305555555555556 | 21.024 |
| 0.8312499999999999 | 16.636 |
| 0.8319444444444444 | 16.636 |
| 0.8326388888888889 | 16.636 |
| 0.8333333333333334 | 12.257 |
| 0.8340277777777777 | 12.257 |
| 0.8347222222222223 | 12.257 |
| 0.8354166666666667 | 12.257 |
| 0.8361111111111111 | 7.887 |
| 0.8368055555555555 | 7.887 |
| 0.8375 | 7.887 |
| 0.8381944444444445 | 7.887 |
| 0.8388888888888889 | 3.525 |
| 0.8395833333333332 | 3.525 |
| 0.8402777777777778 | 3.525 |
| 0.8409722222222222 | 3.525 |
| 0.8416666666666667 | 3.525 |
| 0.842361111111111 | 3.525 |
| 0.8430555555555556 | 0 |
| 0.84375 | 3.525 |
| 0.8444444444444444 | 3.525 |
| 0.845138888888889 | 0 |
| 0.8458333333333333 | 0 |
| 0.8465277777777778 | 0 |
| 0.8472222222222222 | 0 |
| 0.8479166666666668 | 0 |
| 0.8486111111111111 | 0 |
| 0.8493055555555555 | 0 |
| 0.85 | 0 |
| 0.8506944444444445 | 0 |
| 0.8513888888888889 | 0 |
| 0.8520833333333333 | 0 |
| 0.8527777777777777 | 0 |
| 0.8534722222222223 | 0 |
| 0.8541666666666666 | 0 |
| 0.8548611111111111 | 0 |
| 0.8555555555555556 | 0 |
| 0.8562500000000001 | 0 |
| 0.8569444444444444 | 0 |
| 0.8576388888888888 | 0 |
| 0.8583333333333334 | 0 |
| 0.8590277777777778 | 0 |
| 0.8597222222222222 | 0 |
| 0.8604166666666666 | 0 |
| 0.8611111111111112 | 0 |
| 0.8618055555555556 | 0 |
| 0.8624999999999999 | 0 |
| 0.8631944444444444 | 0 |
| 0.8638888888888889 | 0 |
| 0.8645833333333334 | 0 |
| 0.8652777777777777 | 0 |
| 0.8659722222222223 | 0 |
| 0.8666666666666667 | 0 |
| 0.8673611111111111 | 0 |
| 0.8680555555555555 | 0 |
| 0.86875 | 0 |
| 0.8694444444444445 | 0 |
| 0.8701388888888889 | 0 |
| 0.8708333333333332 | 0 |
| 0.8715277777777778 | 0 |
| 0.8722222222222222 | 0 |
| 0.8729166666666667 | 0 |
| 0.873611111111111 | 0 |
| 0.8743055555555556 | 0 |
| 0.875 | 0 |
| 0.8756944444444444 | 0 |
| 0.876388888888889 | 0 |
| 0.8770833333333333 | 0 |
| 0.8777777777777778 | 0 |
| 0.8784722222222222 | 0 |
| 0.8791666666666668 | 0 |
| 0.8798611111111111 | 0 |
| 0.8805555555555555 | 0 |
| 0.88125 | 0 |
| 0.8819444444444445 | 0 |
| 0.8826388888888889 | 0 |
| 0.8833333333333333 | 0 |
| 0.8840277777777777 | 0 |
| 0.8847222222222223 | 0 |
| 0.8854166666666666 | 0 |
| 0.8861111111111111 | 0 |
| 0.8868055555555556 | 0 |
| 0.8875000000000001 | 0 |
| 0.8881944444444444 | 0 |
| 0.8888888888888888 | 0 |
| 0.8895833333333334 | 0 |
| 0.8902777777777778 | 0 |
| 0.8909722222222222 | 0 |
| 0.8916666666666666 | 0 |
| 0.8923611111111112 | 0 |
| 0.8930555555555556 | 0 |
| 0.8937499999999999 | 0 |
| 0.8944444444444444 | 0 |
| 0.8951388888888889 | 0 |
| 0.8958333333333334 | 0 |
| 0.8965277777777777 | 0 |
| 0.8972222222222223 | 0 |
| 0.8979166666666667 | 0 |
| 0.8986111111111111 | 0 |
| 0.8993055555555555 | 0 |
| 0.9 | 0 |
| 0.9006944444444445 | 0 |
| 0.9013888888888889 | 0 |
| 0.9020833333333332 | 0 |
| 0.9027777777777778 | 0 |
| 0.9034722222222222 | 0 |
| 0.9041666666666667 | 0 |
| 0.904861111111111 | 0 |
| 0.9055555555555556 | 0 |
| 0.90625 | 0 |
| 0.9069444444444444 | 0 |
| 0.907638888888889 | 0 |
| 0.9083333333333333 | 0 |
| 0.9090277777777778 | 0 |
| 0.9097222222222222 | 0 |
| 0.9104166666666668 | 0 |
| 0.9111111111111111 | 0 |
| 0.9118055555555555 | 0 |
| 0.9125 | 0 |
| 0.9131944444444445 | 0 |
| 0.9138888888888889 | 0 |
| 0.9145833333333333 | 0 |
| 0.9152777777777777 | 0 |
| 0.9159722222222223 | 0 |
| 0.9166666666666666 | 0 |
| 0.9173611111111111 | 0 |
| 0.9180555555555556 | 0 |
| 0.9187500000000001 | 0 |
| 0.9194444444444444 | 0 |
| 0.9201388888888888 | 0 |
| 0.9208333333333334 | 0 |
| 0.9215277777777778 | 0 |
| 0.9222222222222222 | 0 |
| 0.9229166666666666 | 0 |
| 0.9236111111111112 | 0 |
| 0.9243055555555556 | 0 |
| 0.9249999999999999 | 0 |
| 0.9256944444444444 | 0 |
| 0.9263888888888889 | 0 |
| 0.9270833333333334 | 0 |
| 0.9277777777777777 | 0 |
| 0.9284722222222223 | 0 |
| 0.9291666666666667 | 0 |
| 0.9298611111111111 | 0 |
| 0.9305555555555555 | 0 |
| 0.93125 | 0 |
| 0.9319444444444445 | 0 |
| 0.9326388888888889 | 0 |
| 0.9333333333333332 | 0 |
| 0.9340277777777778 | 0 |
| 0.9347222222222222 | 0 |
| 0.9354166666666667 | 0 |
| 0.936111111111111 | 0 |
| 0.9368055555555556 | 0 |
| 0.9375 | 0 |
| 0.9381944444444444 | 0 |
| 0.938888888888889 | 0 |
| 0.9395833333333333 | 0 |
| 0.9402777777777778 | 0 |
| 0.9409722222222222 | 0 |
| 0.9416666666666668 | 0 |
| 0.9423611111111111 | 0 |
| 0.9430555555555555 | 0 |
| 0.94375 | 0 |
| 0.9444444444444445 | 0 |
| 0.9451388888888889 | 0 |
| 0.9458333333333333 | 0 |
| 0.9465277777777777 | 0 |
| 0.9472222222222223 | 0 |
| 0.9479166666666666 | 0 |
| 0.9486111111111111 | 0 |
| 0.9493055555555556 | 0 |
| 0.9500000000000001 | 0 |
| 0.9506944444444444 | 0 |
| 0.9513888888888888 | 0 |
| 0.9520833333333334 | 0 |
| 0.9527777777777778 | 0 |
| 0.9534722222222222 | 0 |
| 0.9541666666666666 | 0 |
| 0.9548611111111112 | 0 |
| 0.9555555555555556 | 0 |
| 0.9562499999999999 | 0 |
| 0.9569444444444444 | 0 |
| 0.9576388888888889 | 0 |
| 0.9583333333333334 | 0 |
| 0.9590277777777777 | 0 |
| 0.9597222222222223 | 0 |
| 0.9604166666666667 | 0 |
| 0.9611111111111111 | 0 |
| 0.9618055555555555 | 0 |
| 0.9625 | 0 |
| 0.9631944444444445 | 0 |
| 0.9638888888888889 | 0 |
| 0.9645833333333332 | 0 |
| 0.9652777777777778 | 0 |
| 0.9659722222222222 | 0 |
| 0.9666666666666667 | 0 |
| 0.967361111111111 | 0 |
| 0.9680555555555556 | 0 |
| 0.96875 | 0 |
| 0.9694444444444444 | 0 |
| 0.970138888888889 | 0 |
| 0.9708333333333333 | 0 |
| 0.9715277777777778 | 0 |
| 0.9722222222222222 | 0 |
| 0.9729166666666668 | 0 |
| 0.9736111111111111 | 0 |
| 0.9743055555555555 | 0 |
| 0.975 | 0 |
| 0.9756944444444445 | 0 |
| 0.9763888888888889 | 0 |
| 0.9770833333333333 | 0 |
| 0.9777777777777777 | 0 |
| 0.9784722222222223 | 0 |
| 0.9791666666666666 | 0 |
| 0.9798611111111111 | 0 |
| 0.9805555555555556 | 0 |
| 0.9812500000000001 | 0 |
| 0.9819444444444444 | 0 |
| 0.9826388888888888 | 0 |
| 0.9833333333333334 | 0 |
| 0.9840277777777778 | 0 |
| 0.9847222222222222 | 0 |
| 0.9854166666666666 | 0 |
| 0.9861111111111112 | 0 |
| 0.9868055555555556 | 0 |
| 0.9874999999999999 | 0 |
| 0.9881944444444444 | 0 |
| 0.9888888888888889 | 0 |
| 0.9895833333333334 | 0 |
| 0.9902777777777777 | 0 |
| 0.9909722222222223 | 0 |
| 0.9916666666666667 | 0 |
| 0.9923611111111111 | 0 |
| 0.9930555555555555 | 0 |
| 0.99375 | 0 |
| 0.9944444444444445 | 0 |
| 0.9951388888888889 | 0 |
| 0.9958333333333332 | 0 |
| 0.9965277777777778 | 0 |
| 0.9972222222222222 | 0 |
| 0.9979166666666667 | 0 |
| 0.998611111111111 | 0 |
| 0.9993055555555556 | 0 |